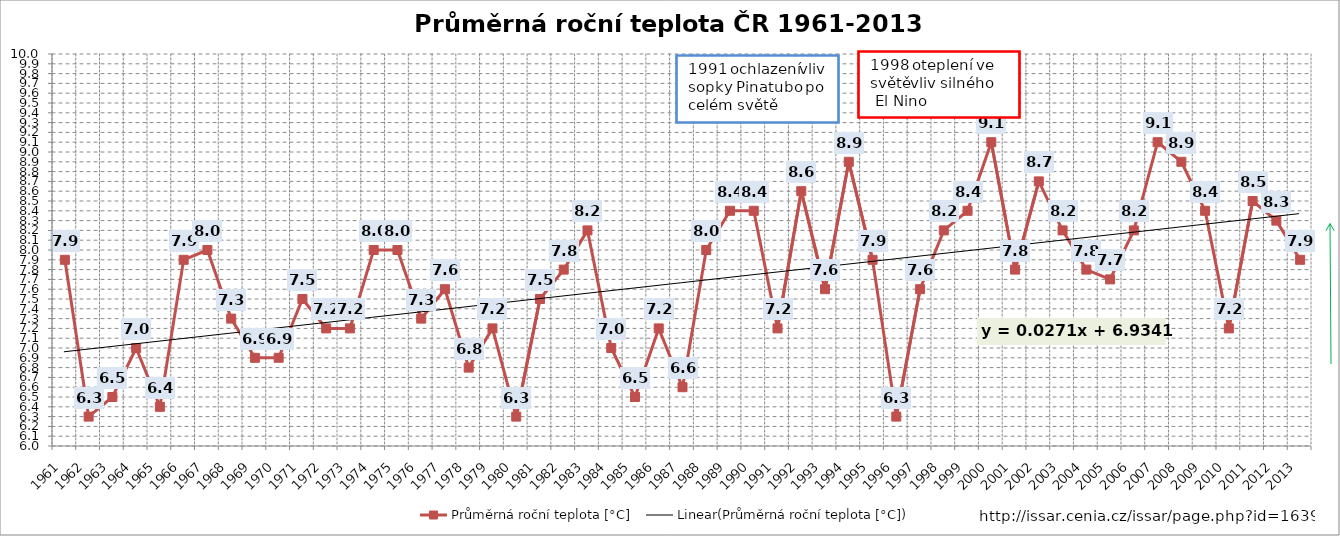
| Category | Průměrná roční teplota [°C] |
|---|---|
| 1961.0 | 7.9 |
| 1962.0 | 6.3 |
| 1963.0 | 6.5 |
| 1964.0 | 7 |
| 1965.0 | 6.4 |
| 1966.0 | 7.9 |
| 1967.0 | 8 |
| 1968.0 | 7.3 |
| 1969.0 | 6.9 |
| 1970.0 | 6.9 |
| 1971.0 | 7.5 |
| 1972.0 | 7.2 |
| 1973.0 | 7.2 |
| 1974.0 | 8 |
| 1975.0 | 8 |
| 1976.0 | 7.3 |
| 1977.0 | 7.6 |
| 1978.0 | 6.8 |
| 1979.0 | 7.2 |
| 1980.0 | 6.3 |
| 1981.0 | 7.5 |
| 1982.0 | 7.8 |
| 1983.0 | 8.2 |
| 1984.0 | 7 |
| 1985.0 | 6.5 |
| 1986.0 | 7.2 |
| 1987.0 | 6.6 |
| 1988.0 | 8 |
| 1989.0 | 8.4 |
| 1990.0 | 8.4 |
| 1991.0 | 7.2 |
| 1992.0 | 8.6 |
| 1993.0 | 7.6 |
| 1994.0 | 8.9 |
| 1995.0 | 7.9 |
| 1996.0 | 6.3 |
| 1997.0 | 7.6 |
| 1998.0 | 8.2 |
| 1999.0 | 8.4 |
| 2000.0 | 9.1 |
| 2001.0 | 7.8 |
| 2002.0 | 8.7 |
| 2003.0 | 8.2 |
| 2004.0 | 7.8 |
| 2005.0 | 7.7 |
| 2006.0 | 8.2 |
| 2007.0 | 9.1 |
| 2008.0 | 8.9 |
| 2009.0 | 8.4 |
| 2010.0 | 7.2 |
| 2011.0 | 8.5 |
| 2012.0 | 8.3 |
| 2013.0 | 7.9 |